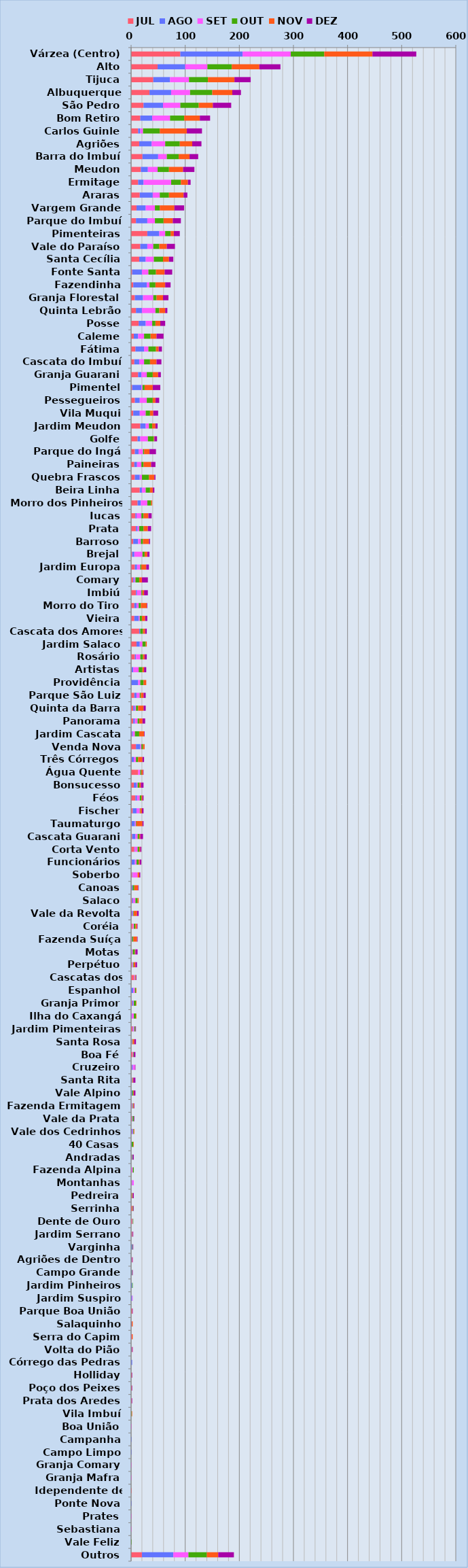
| Category | JUL | AGO | SET | OUT | NOV | DEZ |
|---|---|---|---|---|---|---|
| Várzea (Centro) | 91 | 115 | 89 | 62 | 89 | 81 |
| Alto | 49 | 51 | 41 | 45 | 51 | 39 |
| Tijuca | 41 | 31 | 35 | 35 | 49 | 30 |
| Albuquerque | 34 | 40 | 35 | 41 | 37 | 16 |
| São Pedro | 23 | 36 | 32 | 34 | 26 | 34 |
| Bom Retiro | 17 | 22 | 33 | 26 | 29 | 19 |
| Carlos Guinle | 13 | 4 | 5 | 31 | 50 | 28 |
| Agriões | 15 | 23 | 25 | 27 | 23 | 17 |
| Barra do Imbuí | 21 | 29 | 16 | 22 | 20 | 16 |
| Meudon | 18 | 13 | 18 | 21 | 26 | 21 |
| Ermitage | 13 | 10 | 51 | 18 | 13 | 5 |
| Araras | 16 | 24 | 13 | 17 | 27 | 7 |
| Vargem Grande | 10 | 17 | 17 | 9 | 27 | 18 |
| Parque do Imbuí | 9 | 21 | 14 | 16 | 17 | 15 |
| Pimenteiras | 30 | 22 | 11 | 10 | 6 | 11 |
| Vale do Paraíso | 17 | 13 | 11 | 11 | 14 | 15 |
| Santa Cecília | 15 | 12 | 15 | 17 | 11 | 8 |
| Fonte Santa | 2 | 18 | 12 | 14 | 16 | 14 |
| Fazendinha | 4 | 25 | 5 | 11 | 18 | 10 |
| Granja Florestal | 7 | 15 | 19 | 6 | 12 | 10 |
| Quinta Lebrão | 9 | 11 | 25 | 7 | 11 | 4 |
| Posse | 14 | 13 | 12 | 6 | 9 | 9 |
| Caleme | 5 | 8 | 11 | 12 | 11 | 13 |
| Fátima | 8 | 16 | 8 | 14 | 5 | 6 |
| Cascata do Imbuí | 6 | 9 | 9 | 11 | 12 | 9 |
| Granja Guarani | 13 | 6 | 10 | 11 | 10 | 5 |
| Pimentel | 2 | 17 | 2 | 4 | 15 | 14 |
| Pessegueiros | 7 | 9 | 13 | 11 | 5 | 7 |
| Vila Muqui | 4 | 12 | 11 | 8 | 6 | 9 |
| Jardim Meudon | 17 | 10 | 6 | 6 | 6 | 4 |
| Golfe | 12 | 5 | 14 | 11 | 1 | 5 |
| Parque do Ingá | 7 | 7 | 8 | 2 | 10 | 12 |
| Paineiras | 6 | 5 | 8 | 4 | 14 | 8 |
| Quebra Frascos | 7 | 9 | 4 | 13 | 10 | 2 |
| Beira Linha | 16 | 4 | 7 | 8 | 5 | 3 |
| Morro dos Pinheiros | 12 | 6 | 12 | 7 | 2 | 0 |
| Iucas | 8 | 2 | 9 | 4 | 9 | 6 |
| Prata | 9 | 3 | 3 | 8 | 8 | 6 |
| Barroso | 4 | 9 | 5 | 4 | 11 | 2 |
| Brejal | 2 | 4 | 15 | 4 | 5 | 4 |
| Jardim Europa | 7 | 4 | 6 | 2 | 9 | 5 |
| Comary | 4 | 2 | 2 | 7 | 5 | 11 |
| Imbiú | 9 | 2 | 8 | 2 | 3 | 7 |
| Morro do Tiro | 6 | 4 | 4 | 4 | 11 | 1 |
| Vieira | 6 | 8 | 2 | 4 | 6 | 4 |
| Cascata dos Amores | 15 | 2 | 0 | 5 | 4 | 3 |
| Jardim Salaco | 10 | 6 | 5 | 6 | 2 | 0 |
| Rosário | 7 | 2 | 8 | 5 | 3 | 4 |
| Artistas | 1 | 3 | 10 | 7 | 3 | 4 |
| Providência | 0 | 13 | 4 | 6 | 5 | 0 |
| Parque São Luiz | 6 | 4 | 6 | 2 | 5 | 4 |
| Quinta da Barra | 4 | 3 | 2 | 4 | 10 | 4 |
| Panorama | 4 | 3 | 5 | 3 | 6 | 5 |
| Jardim Cascata | 1 | 2 | 4 | 8 | 9 | 1 |
| Venda Nova | 9 | 8 | 2 | 3 | 3 | 0 |
| Três Córregos | 1 | 4 | 4 | 4 | 8 | 3 |
| Água Quente | 13 | 0 | 4 | 2 | 3 | 1 |
| Bonsucesso | 5 | 5 | 2 | 3 | 3 | 5 |
| Féos | 8 | 3 | 5 | 3 | 2 | 2 |
| Fischer | 3 | 7 | 6 | 1 | 3 | 3 |
| Taumaturgo | 1 | 6 | 2 | 1 | 11 | 2 |
| Cascata Guarani | 2 | 6 | 4 | 3 | 2 | 5 |
| Corta Vento | 6 | 1 | 5 | 3 | 2 | 2 |
| Funcionários | 1 | 6 | 3 | 4 | 2 | 3 |
| Soberbo | 2 | 1 | 9 | 0 | 3 | 2 |
| Canoas | 1 | 2 | 0 | 3 | 7 | 1 |
| Salaco | 2 | 2 | 4 | 4 | 2 | 0 |
| Vale da Revolta | 1 | 2 | 1 | 1 | 6 | 3 |
| Coréia | 3 | 0 | 2 | 3 | 3 | 1 |
| Fazenda Suíça | 1 | 1 | 0 | 2 | 7 | 1 |
| Motas | 0 | 1 | 2 | 4 | 1 | 4 |
| Perpétuo | 2 | 1 | 1 | 1 | 3 | 3 |
| Cascatas dos Amores | 5 | 0 | 2 | 1 | 1 | 1 |
| Espanhol | 0 | 4 | 3 | 2 | 1 | 0 |
| Granja Primor | 2 | 2 | 1 | 4 | 1 | 0 |
| Ilha do Caxangá | 0 | 1 | 4 | 4 | 1 | 0 |
| Jardim Pimenteiras | 3 | 1 | 2 | 2 | 0 | 1 |
| Santa Rosa | 0 | 1 | 1 | 1 | 3 | 3 |
| Boa Fé | 3 | 0 | 1 | 1 | 0 | 3 |
| Cruzeiro | 1 | 2 | 4 | 0 | 0 | 1 |
| Santa Rita | 0 | 1 | 1 | 1 | 1 | 4 |
| Vale Alpino | 0 | 2 | 0 | 2 | 1 | 3 |
| Fazenda Ermitagem | 1 | 1 | 1 | 1 | 1 | 1 |
| Vale da Prata | 2 | 1 | 0 | 2 | 0 | 1 |
| Vale dos Cedrinhos | 1 | 2 | 1 | 1 | 1 | 0 |
| 40 Casas | 0 | 1 | 0 | 3 | 1 | 0 |
| Andradas | 1 | 1 | 0 | 1 | 0 | 2 |
| Fazenda Alpina | 0 | 0 | 3 | 2 | 0 | 0 |
| Montanhas | 1 | 1 | 3 | 0 | 0 | 0 |
| Pedreira | 1 | 0 | 0 | 1 | 1 | 2 |
| Serrinha | 3 | 0 | 0 | 1 | 0 | 1 |
| Dente de Ouro | 2 | 0 | 1 | 1 | 0 | 0 |
| Jardim Serrano | 1 | 1 | 0 | 0 | 1 | 1 |
| Varginha | 0 | 2 | 0 | 1 | 0 | 1 |
| Agriões de Dentro | 0 | 1 | 0 | 0 | 1 | 1 |
| Campo Grande | 0 | 1 | 0 | 1 | 0 | 1 |
| Jardim Pinheiros | 0 | 2 | 0 | 1 | 0 | 0 |
| Jardim Suspiro | 0 | 2 | 1 | 0 | 0 | 0 |
| Parque Boa União | 1 | 0 | 0 | 0 | 1 | 1 |
| Salaquinho | 0 | 1 | 0 | 0 | 2 | 0 |
| Serra do Capim | 0 | 0 | 1 | 0 | 2 | 0 |
| Volta do Pião | 0 | 1 | 0 | 0 | 1 | 1 |
| Córrego das Pedras | 0 | 2 | 0 | 0 | 0 | 0 |
| Holliday | 0 | 0 | 0 | 0 | 1 | 1 |
| Poço dos Peixes | 0 | 0 | 0 | 0 | 1 | 1 |
| Prata dos Aredes | 1 | 0 | 0 | 0 | 0 | 1 |
| Vila Imbuí | 0 | 0 | 0 | 1 | 1 | 0 |
| Boa União | 0 | 0 | 1 | 0 | 0 | 0 |
| Campanha | 0 | 1 | 0 | 0 | 0 | 0 |
| Campo Limpo | 0 | 1 | 0 | 0 | 0 | 0 |
| Granja Comary | 0 | 0 | 1 | 0 | 0 | 0 |
| Granja Mafra | 0 | 0 | 1 | 0 | 0 | 0 |
| Idependente de Motas | 1 | 0 | 0 | 0 | 0 | 0 |
| Ponte Nova | 0 | 1 | 0 | 0 | 0 | 0 |
| Prates | 0 | 0 | 1 | 0 | 0 | 0 |
| Sebastiana | 0 | 0 | 1 | 0 | 0 | 0 |
| Vale Feliz | 0 | 0 | 0 | 1 | 0 | 0 |
| Outros | 20 | 58 | 28 | 34 | 21 | 29 |